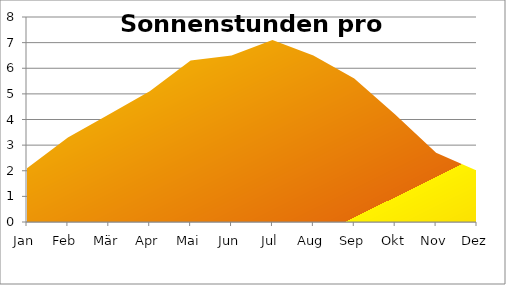
| Category | Sonnenstunden (h/d) |
|---|---|
| Jan | 2.1 |
| Feb | 3.3 |
| Mär | 4.2 |
| Apr | 5.1 |
| Mai | 6.3 |
| Jun | 6.5 |
| Jul | 7.1 |
| Aug | 6.5 |
| Sep | 5.6 |
| Okt | 4.2 |
| Nov | 2.7 |
| Dez | 2 |